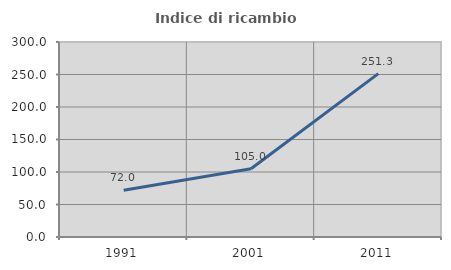
| Category | Indice di ricambio occupazionale  |
|---|---|
| 1991.0 | 72.012 |
| 2001.0 | 104.971 |
| 2011.0 | 251.295 |